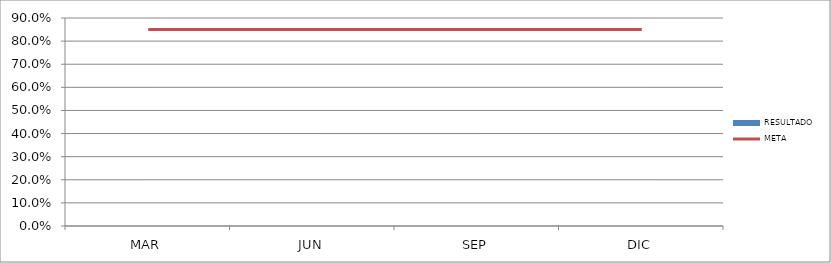
| Category | RESULTADO |
|---|---|
| MAR | 0 |
| JUN | 0 |
| SEP | 0 |
| DIC | 0 |